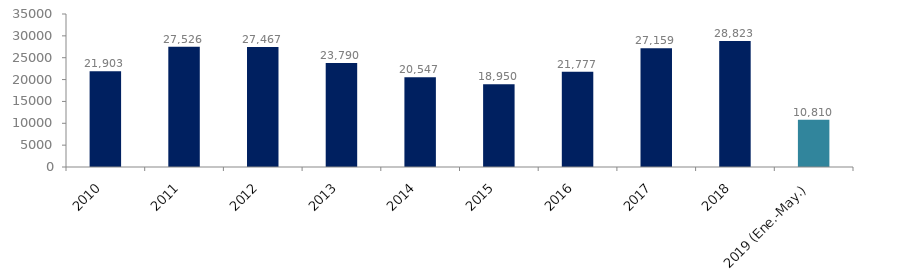
| Category | Series 1 |
|---|---|
| 2010 | 21903 |
| 2011 | 27526 |
| 2012 | 27467 |
| 2013 | 23790 |
| 2014 | 20547 |
| 2015 | 18950.14 |
| 2016 | 21776.636 |
| 2017 | 27158.582 |
| 2018 | 28823.486 |
| 2019 (Ene.-May.) | 10810.306 |